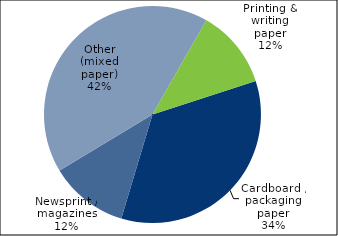
| Category | Series 0 |
|---|---|
| Cardboard / packaging paper | 513054 |
| Newsprint / magazines | 173864 |
| Other (mixed paper) | 620347 |
| Printing & writing paper | 173752 |